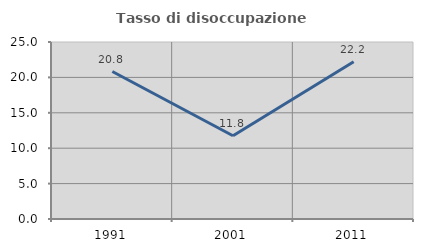
| Category | Tasso di disoccupazione giovanile  |
|---|---|
| 1991.0 | 20.833 |
| 2001.0 | 11.765 |
| 2011.0 | 22.222 |